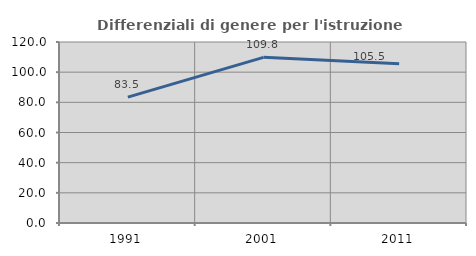
| Category | Differenziali di genere per l'istruzione superiore |
|---|---|
| 1991.0 | 83.485 |
| 2001.0 | 109.842 |
| 2011.0 | 105.535 |